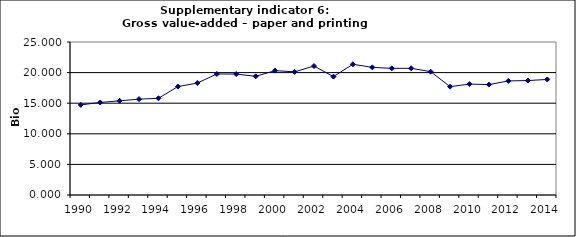
| Category | Gross value-added – paper and printing industry, Bio Euro (EC95) |
|---|---|
| 1990 | 14.729 |
| 1991 | 15.119 |
| 1992 | 15.385 |
| 1993 | 15.659 |
| 1994 | 15.807 |
| 1995 | 17.718 |
| 1996 | 18.291 |
| 1997 | 19.776 |
| 1998 | 19.761 |
| 1999 | 19.392 |
| 2000 | 20.324 |
| 2001 | 20.12 |
| 2002 | 21.075 |
| 2003 | 19.343 |
| 2004 | 21.361 |
| 2005 | 20.854 |
| 2006 | 20.695 |
| 2007 | 20.703 |
| 2008 | 20.153 |
| 2009 | 17.705 |
| 2010 | 18.127 |
| 2011 | 18.04 |
| 2012 | 18.639 |
| 2013 | 18.7 |
| 2014 | 18.882 |